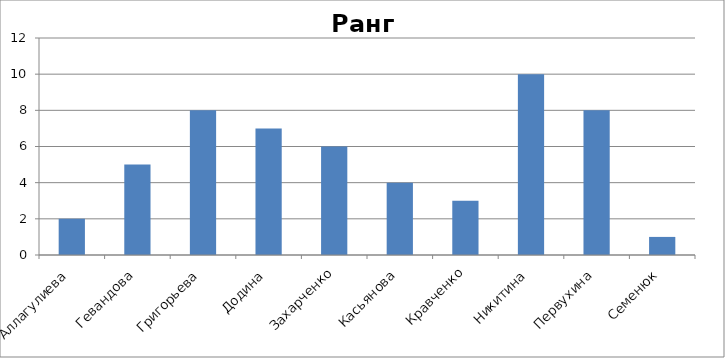
| Category | 1:2:3:4:5:6:7:8:9:10 |
|---|---|
| 0 | 2 |
| 1 | 5 |
| 2 | 8 |
| 3 | 7 |
| 4 | 6 |
| 5 | 4 |
| 6 | 3 |
| 7 | 10 |
| 8 | 8 |
| 9 | 1 |